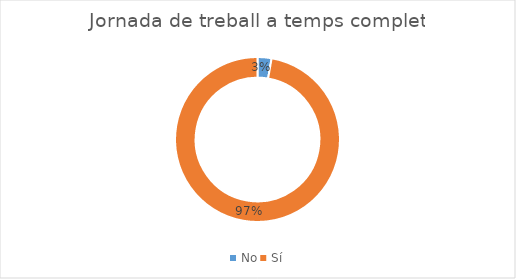
| Category | Series 0 |
|---|---|
| No | 2 |
| Sí | 71 |